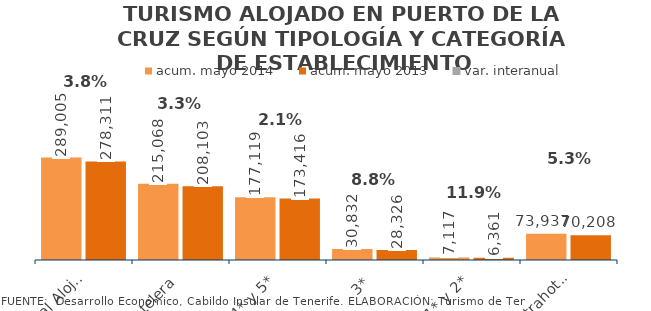
| Category | acum. mayo 2014 | acum. mayo 2013 |
|---|---|---|
| Total Alojados | 289005 | 278311 |
| Hotelera | 215068 | 208103 |
| 4* y 5* | 177119 | 173416 |
| 3* | 30832 | 28326 |
| 1* y 2* | 7117 | 6361 |
| Extrahotelera | 73937 | 70208 |